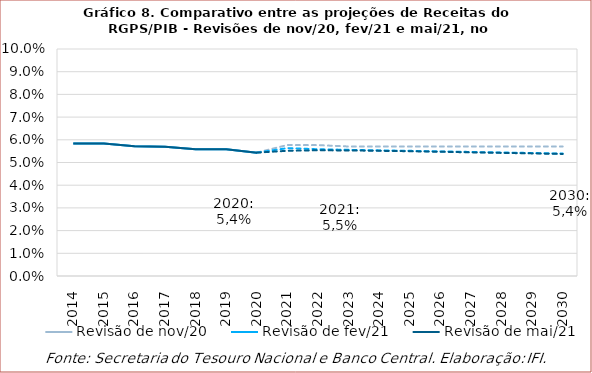
| Category | Revisão de nov/20 | Revisão de fev/21 | Revisão de mai/21 |
|---|---|---|---|
| 2014.0 | 0.058 | 0.058 | 0.058 |
| 2015.0 | 0.058 | 0.058 | 0.058 |
| 2016.0 | 0.057 | 0.057 | 0.057 |
| 2017.0 | 0.057 | 0.057 | 0.057 |
| 2018.0 | 0.056 | 0.056 | 0.056 |
| 2019.0 | 0.056 | 0.056 | 0.056 |
| 2020.0 | 0.054 | 0.054 | 0.054 |
| 2021.0 | 0.058 | 0.056 | 0.055 |
| 2022.0 | 0.058 | 0.056 | 0.055 |
| 2023.0 | 0.057 | 0.056 | 0.055 |
| 2024.0 | 0.057 | 0.055 | 0.055 |
| 2025.0 | 0.057 | 0.055 | 0.055 |
| 2026.0 | 0.057 | 0.055 | 0.055 |
| 2027.0 | 0.057 | 0.055 | 0.054 |
| 2028.0 | 0.057 | 0.054 | 0.054 |
| 2029.0 | 0.057 | 0.054 | 0.054 |
| 2030.0 | 0.057 | 0.054 | 0.054 |